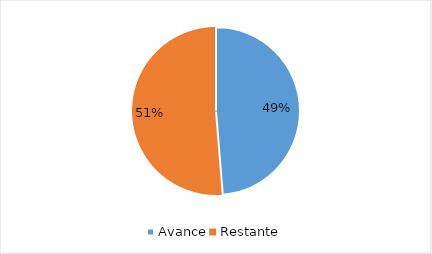
| Category | Series 0 |
|---|---|
| Avance | 0.487 |
| Restante | 0.513 |